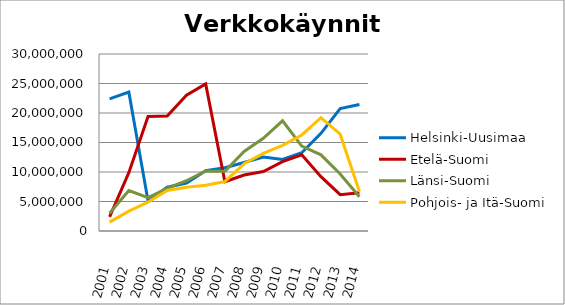
| Category | Helsinki-Uusimaa | Etelä-Suomi | Länsi-Suomi | Pohjois- ja Itä-Suomi |
|---|---|---|---|---|
| 2001.0 | 22401471 | 2392836 | 3000211 | 1509610 |
| 2002.0 | 23561296 | 9885673 | 6854665 | 3360275 |
| 2003.0 | 5087023 | 19390986 | 5646891 | 4901236 |
| 2004.0 | 7430546 | 19487618 | 7208571 | 6879900 |
| 2005.0 | 8123010 | 23015213 | 8518271 | 7422886 |
| 2006.0 | 10205142 | 24919833 | 10183423 | 7740933 |
| 2007.0 | 10727390 | 8352644 | 10131711 | 8386061 |
| 2008.0 | 11606893 | 9478466 | 13481541 | 11389641 |
| 2009.0 | 12540471 | 10072246 | 15722676 | 13167351 |
| 2010.0 | 12128539 | 11756994 | 18680803 | 14511952 |
| 2011.0 | 13259435 | 12902580 | 14389687 | 16279144 |
| 2012.0 | 16559015 | 9205636 | 12912455 | 19207872 |
| 2013.0 | 20740262 | 6154419 | 9666597 | 16407472 |
| 2014.0 | 21441947 | 6465677 | 5799401 | 6681941.96 |